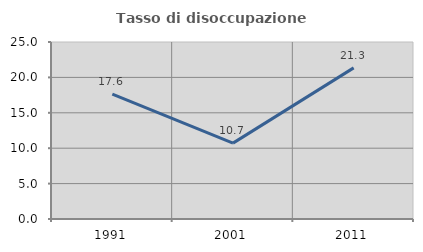
| Category | Tasso di disoccupazione giovanile  |
|---|---|
| 1991.0 | 17.641 |
| 2001.0 | 10.714 |
| 2011.0 | 21.344 |